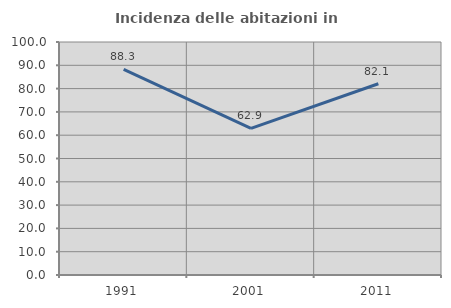
| Category | Incidenza delle abitazioni in proprietà  |
|---|---|
| 1991.0 | 88.27 |
| 2001.0 | 62.893 |
| 2011.0 | 82.069 |